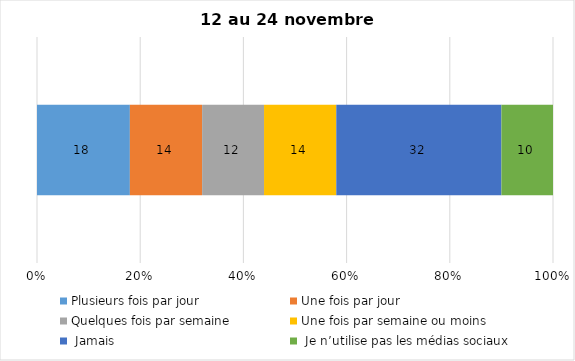
| Category | Plusieurs fois par jour | Une fois par jour | Quelques fois par semaine   | Une fois par semaine ou moins   |  Jamais   |  Je n’utilise pas les médias sociaux |
|---|---|---|---|---|---|---|
| 0 | 18 | 14 | 12 | 14 | 32 | 10 |